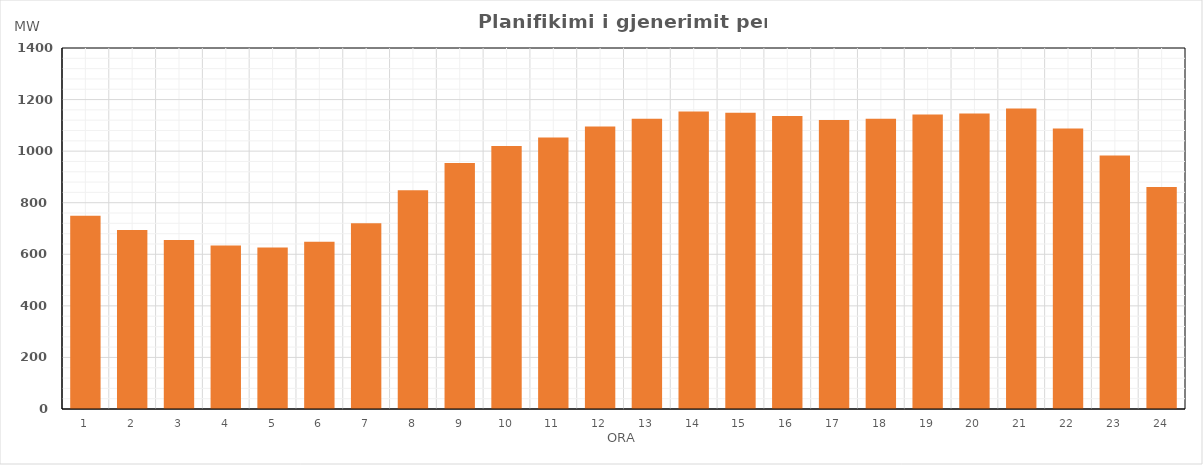
| Category | Max (MW) |
|---|---|
| 0 | 749.64 |
| 1 | 694.37 |
| 2 | 655.05 |
| 3 | 634.17 |
| 4 | 625.87 |
| 5 | 649.06 |
| 6 | 720.22 |
| 7 | 848.72 |
| 8 | 953.55 |
| 9 | 1019.8 |
| 10 | 1053.34 |
| 11 | 1095.81 |
| 12 | 1125.8 |
| 13 | 1153.63 |
| 14 | 1148.41 |
| 15 | 1136.43 |
| 16 | 1120.55 |
| 17 | 1125.63 |
| 18 | 1141.72 |
| 19 | 1145.83 |
| 20 | 1165.38 |
| 21 | 1087.88 |
| 22 | 983 |
| 23 | 861.19 |